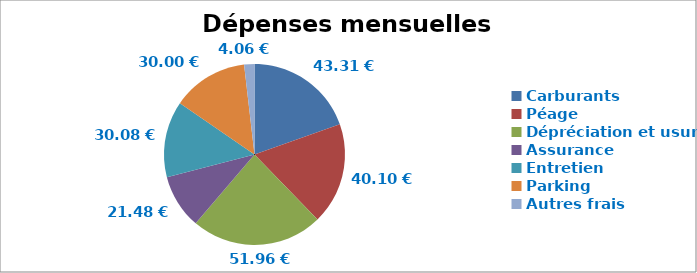
| Category | Dépenses mensuelles commutage |
|---|---|
| Carburants | 43.312 |
| Péage | 40.104 |
| Dépréciation et usure | 51.961 |
| Assurance | 21.484 |
| Entretien | 30.078 |
| Parking | 30 |
| Autres frais | 4.064 |